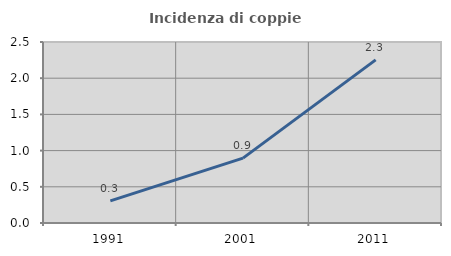
| Category | Incidenza di coppie miste |
|---|---|
| 1991.0 | 0.306 |
| 2001.0 | 0.896 |
| 2011.0 | 2.254 |